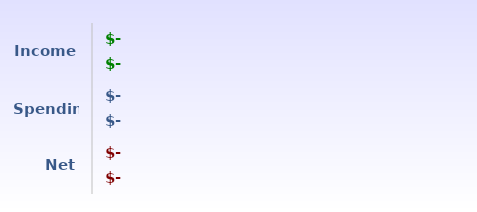
| Category | Series 2 | Series 0 |
|---|---|---|
| Net | 0 | 0 |
| Spending | 0 | 0 |
| Income | 0 | 0 |